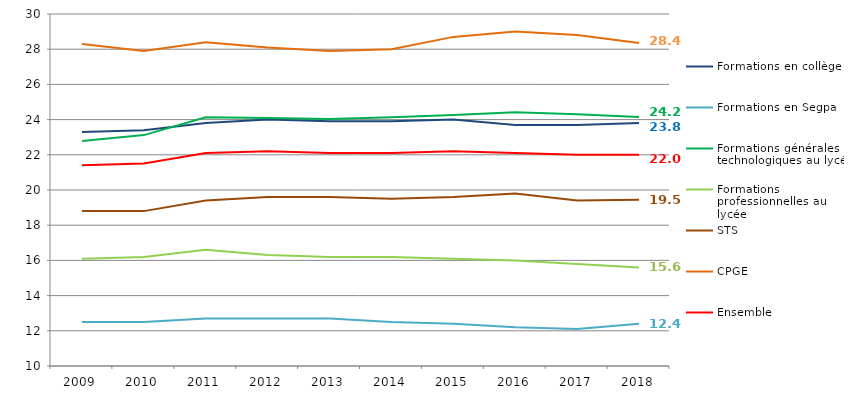
| Category | Formations en collège  | Formations en Segpa | Formations générales et technologiques au lycée | Formations professionnelles au lycée | STS | CPGE | Ensemble |
|---|---|---|---|---|---|---|---|
| 2009.0 | 23.3 | 12.5 | 22.78 | 16.1 | 18.8 | 28.3 | 21.4 |
| 2010.0 | 23.4 | 12.5 | 23.12 | 16.2 | 18.8 | 27.9 | 21.5 |
| 2011.0 | 23.8 | 12.7 | 24.13 | 16.6 | 19.4 | 28.4 | 22.1 |
| 2012.0 | 24 | 12.7 | 24.09 | 16.3 | 19.6 | 28.1 | 22.2 |
| 2013.0 | 23.9 | 12.7 | 24.04 | 16.2 | 19.6 | 27.9 | 22.1 |
| 2014.0 | 23.9 | 12.5 | 24.13 | 16.2 | 19.5 | 28 | 22.1 |
| 2015.0 | 24 | 12.4 | 24.26 | 16.1 | 19.6 | 28.7 | 22.2 |
| 2016.0 | 23.7 | 12.2 | 24.42 | 16 | 19.8 | 29 | 22.1 |
| 2017.0 | 23.7 | 12.1 | 24.31 | 15.8 | 19.4 | 28.8 | 22 |
| 2018.0 | 23.8 | 12.4 | 24.15 | 15.6 | 19.45 | 28.35 | 22 |